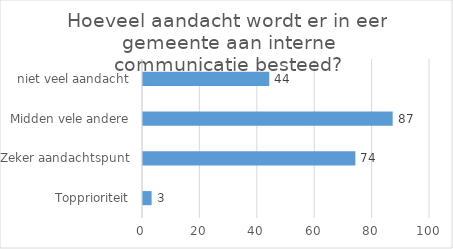
| Category | Series 0 |
|---|---|
| Topprioriteit | 3 |
| Zeker aandachtspunt | 74 |
| Midden vele andere | 87 |
| niet veel aandacht | 44 |